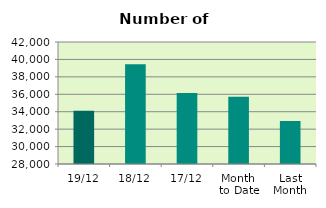
| Category | Series 0 |
|---|---|
| 19/12 | 34110 |
| 18/12 | 39438 |
| 17/12 | 36150 |
| Month 
to Date | 35716.714 |
| Last
Month | 32932.667 |